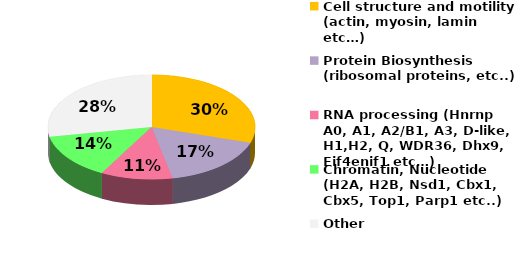
| Category | Series 0 |
|---|---|
| Cell structure and motility (actin, myosin, lamin etc…) | 32 |
| Protein Biosynthesis (ribosomal proteins, etc..) | 18 |
| RNA processing (Hnrnp A0, A1, A2/B1, A3, D-like, H1,H2, Q, WDR36, Dhx9, Eif4enif1 etc…) | 12 |
| Chromatin, Nucleotide (H2A, H2B, Nsd1, Cbx1, Cbx5, Top1, Parp1 etc..) | 15 |
| Other | 30 |